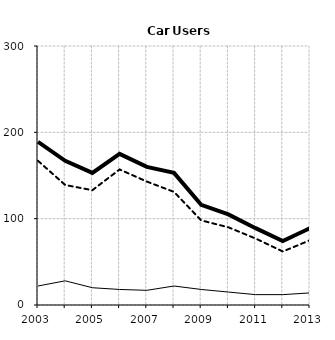
| Category | Built-up | Non built-up | Total |
|---|---|---|---|
| 2003.0 | 22 | 167 | 189 |
| 2004.0 | 28 | 139 | 167 |
| 2005.0 | 20 | 133 | 153 |
| 2006.0 | 18 | 157 | 175 |
| 2007.0 | 17 | 143 | 160 |
| 2008.0 | 22 | 131 | 153 |
| 2009.0 | 18 | 98 | 116 |
| 2010.0 | 15 | 90 | 105 |
| 2011.0 | 12 | 77 | 89 |
| 2012.0 | 12 | 62 | 74 |
| 2013.0 | 14 | 75 | 89 |